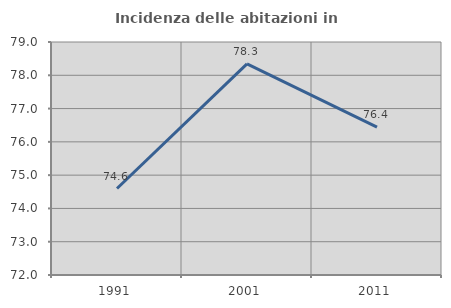
| Category | Incidenza delle abitazioni in proprietà  |
|---|---|
| 1991.0 | 74.598 |
| 2001.0 | 78.344 |
| 2011.0 | 76.445 |